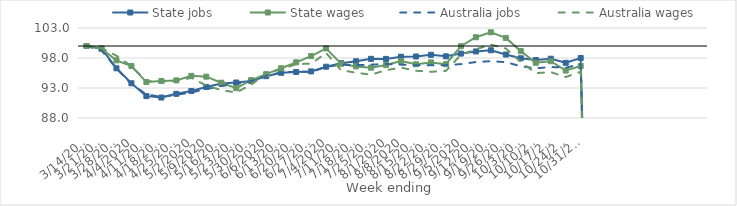
| Category | State jobs | State wages | Australia jobs | Australia wages |
|---|---|---|---|---|
| 14/03/2020 | 100 | 100 | 100 | 100 |
| 21/03/2020 | 99.58 | 99.55 | 99.261 | 99.662 |
| 28/03/2020 | 96.282 | 97.61 | 96.28 | 98.386 |
| 04/04/2020 | 93.788 | 96.663 | 93.636 | 96.64 |
| 11/04/2020 | 91.642 | 93.99 | 91.95 | 94.142 |
| 18/04/2020 | 91.413 | 94.16 | 91.517 | 94.044 |
| 25/04/2020 | 92.029 | 94.267 | 91.861 | 94.24 |
| 02/05/2020 | 92.508 | 95.028 | 92.261 | 94.675 |
| 09/05/2020 | 93.17 | 94.892 | 92.816 | 93.417 |
| 16/05/2020 | 93.748 | 93.882 | 93.349 | 92.645 |
| 23/05/2020 | 93.914 | 92.969 | 93.653 | 92.27 |
| 30/05/2020 | 94.167 | 94.313 | 94.153 | 93.543 |
| 06/06/2020 | 94.97 | 95.306 | 95.073 | 95.449 |
| 13/06/2020 | 95.533 | 96.287 | 95.572 | 96.097 |
| 20/06/2020 | 95.669 | 97.28 | 95.727 | 96.992 |
| 27/06/2020 | 95.768 | 98.318 | 95.674 | 97.05 |
| 04/07/2020 | 96.545 | 99.598 | 96.519 | 98.837 |
| 11/07/2020 | 97.14 | 97.044 | 96.892 | 95.976 |
| 18/07/2020 | 97.454 | 96.599 | 96.803 | 95.549 |
| 25/07/2020 | 97.86 | 96.388 | 96.894 | 95.223 |
| 01/08/2020 | 97.848 | 96.846 | 97.004 | 95.974 |
| 08/08/2020 | 98.206 | 97.505 | 96.893 | 96.39 |
| 15/08/2020 | 98.254 | 96.954 | 96.793 | 95.878 |
| 22/08/2020 | 98.538 | 97.262 | 96.797 | 95.7 |
| 29/08/2020 | 98.278 | 96.971 | 96.807 | 95.852 |
| 05/09/2020 | 98.734 | 99.968 | 96.983 | 98.536 |
| 12/09/2020 | 99.092 | 101.463 | 97.328 | 99.459 |
| 19/09/2020 | 99.292 | 102.286 | 97.472 | 100.228 |
| 26/09/2020 | 98.576 | 101.35 | 97.305 | 99.582 |
| 03/10/2020 | 97.96 | 99.148 | 96.626 | 97.348 |
| 10/10/2020 | 97.667 | 97.204 | 96.269 | 95.474 |
| 17/10/2020 | 97.878 | 97.461 | 96.502 | 95.648 |
| 24/10/2020 | 97.199 | 95.911 | 96.383 | 94.829 |
| 31/10/2020 | 98.002 | 96.667 | 96.953 | 95.711 |